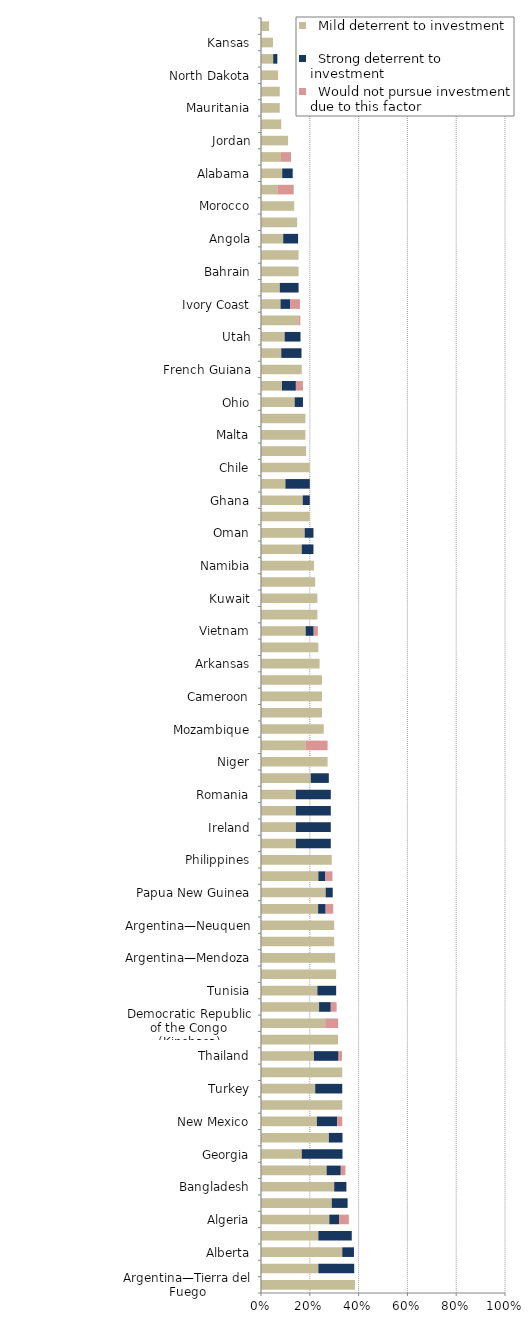
| Category |   Mild deterrent to investment |   Strong deterrent to investment |   Would not pursue investment due to this factor |
|---|---|---|---|
| Argentina—Tierra del Fuego | 0.385 | 0 | 0 |
| Mexico | 0.235 | 0.147 | 0 |
| Alberta | 0.333 | 0.048 | 0 |
| United Kingdom—North Sea | 0.235 | 0.137 | 0 |
| Algeria | 0.28 | 0.04 | 0.04 |
| Netherlands—Offshore | 0.29 | 0.065 | 0 |
| Bangladesh | 0.3 | 0.05 | 0 |
| Myanmar | 0.269 | 0.058 | 0.019 |
| Georgia | 0.167 | 0.167 | 0 |
| Republic of the Congo (Brazzaville) | 0.278 | 0.056 | 0 |
| New Mexico | 0.229 | 0.083 | 0.021 |
| West Virginia | 0.333 | 0 | 0 |
| Turkey | 0.222 | 0.111 | 0 |
| Japan | 0.333 | 0 | 0 |
| Thailand | 0.217 | 0.101 | 0.014 |
| Pakistan | 0.316 | 0 | 0 |
| Democratic Republic of the Congo (Kinshasa) | 0.263 | 0 | 0.053 |
| Montana | 0.238 | 0.048 | 0.024 |
| Tunisia | 0.231 | 0.077 | 0 |
| Trinidad and Tobago | 0.308 | 0 | 0 |
| Argentina—Mendoza | 0.304 | 0 | 0 |
| Cyprus | 0.3 | 0 | 0 |
| Argentina—Neuquen | 0.3 | 0 | 0 |
| Louisiana | 0.234 | 0.031 | 0.031 |
| Papua New Guinea | 0.265 | 0.029 | 0 |
| Egypt | 0.235 | 0.029 | 0.029 |
| Philippines | 0.29 | 0 | 0 |
| Greenland | 0.143 | 0.143 | 0 |
| Ireland | 0.143 | 0.143 | 0 |
| Poland | 0.143 | 0.143 | 0 |
| Romania | 0.143 | 0.143 | 0 |
| Wyoming | 0.204 | 0.074 | 0 |
| Niger | 0.273 | 0 | 0 |
| Syria | 0.182 | 0 | 0.091 |
| Mozambique | 0.257 | 0 | 0 |
| Yukon | 0.25 | 0 | 0 |
| Cameroon | 0.25 | 0 | 0 |
| Chad | 0.25 | 0 | 0 |
| Arkansas | 0.24 | 0 | 0 |
| Lebanon | 0.235 | 0 | 0 |
| Vietnam | 0.183 | 0.033 | 0.017 |
| Kenya | 0.231 | 0 | 0 |
| Kuwait | 0.231 | 0 | 0 |
| Faroe Islands | 0.222 | 0 | 0 |
| Namibia | 0.217 | 0 | 0 |
| Gabon | 0.167 | 0.048 | 0 |
| Oman | 0.179 | 0.036 | 0 |
| Malaysia | 0.2 | 0 | 0 |
| Ghana | 0.171 | 0.029 | 0 |
| Madagascar | 0.1 | 0.1 | 0 |
| Chile | 0.2 | 0 | 0 |
| Equatorial Guinea | 0.185 | 0 | 0 |
| Malta | 0.182 | 0 | 0 |
| Yemen | 0.182 | 0 | 0 |
| Ohio | 0.138 | 0.034 | 0 |
| Libya | 0.086 | 0.057 | 0.029 |
| French Guiana | 0.167 | 0 | 0 |
| Iraq | 0.083 | 0.083 | 0 |
| Utah | 0.097 | 0.065 | 0 |
| Texas | 0.153 | 0 | 0.008 |
| Ivory Coast | 0.08 | 0.04 | 0.04 |
| Brunei | 0.077 | 0.077 | 0 |
| Bahrain | 0.154 | 0 | 0 |
| Qatar | 0.154 | 0 | 0 |
| Angola | 0.091 | 0.061 | 0 |
| United Arab Emirates | 0.148 | 0 | 0 |
| Morocco | 0.136 | 0 | 0 |
| Manitoba | 0.067 | 0 | 0.067 |
| Alabama | 0.087 | 0.043 | 0 |
| Saskatchewan | 0.082 | 0 | 0.041 |
| Jordan | 0.111 | 0 | 0 |
| Suriname | 0.083 | 0 | 0 |
| Mauritania | 0.077 | 0 | 0 |
| Guyana | 0.077 | 0 | 0 |
| North Dakota | 0.07 | 0 | 0 |
| Oklahoma | 0.05 | 0.017 | 0 |
| Kansas | 0.049 | 0 | 0 |
| Mississippi | 0.033 | 0 | 0 |